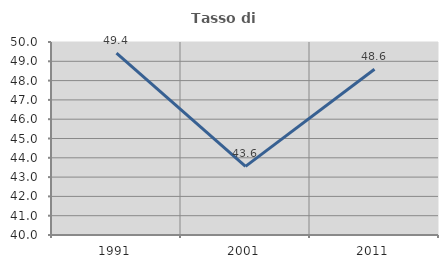
| Category | Tasso di occupazione   |
|---|---|
| 1991.0 | 49.425 |
| 2001.0 | 43.558 |
| 2011.0 | 48.588 |